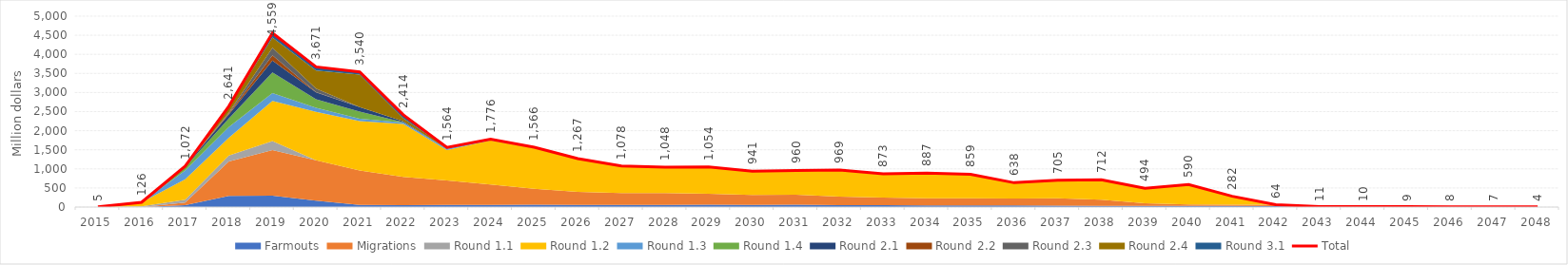
| Category | Total |
|---|---|
| 2015.0 | 4.809 |
| 2016.0 | 125.699 |
| 2017.0 | 1072.307 |
| 2018.0 | 2640.647 |
| 2019.0 | 4558.647 |
| 2020.0 | 3670.97 |
| 2021.0 | 3539.886 |
| 2022.0 | 2414.443 |
| 2023.0 | 1563.599 |
| 2024.0 | 1776.488 |
| 2025.0 | 1566.321 |
| 2026.0 | 1267.105 |
| 2027.0 | 1078.371 |
| 2028.0 | 1047.518 |
| 2029.0 | 1053.757 |
| 2030.0 | 940.795 |
| 2031.0 | 960.225 |
| 2032.0 | 969.091 |
| 2033.0 | 872.99 |
| 2034.0 | 886.82 |
| 2035.0 | 859.452 |
| 2036.0 | 637.757 |
| 2037.0 | 705.204 |
| 2038.0 | 712.26 |
| 2039.0 | 493.604 |
| 2040.0 | 589.951 |
| 2041.0 | 282.456 |
| 2042.0 | 63.974 |
| 2043.0 | 11.076 |
| 2044.0 | 10.397 |
| 2045.0 | 9.347 |
| 2046.0 | 8.4 |
| 2047.0 | 7.386 |
| 2048.0 | 3.884 |